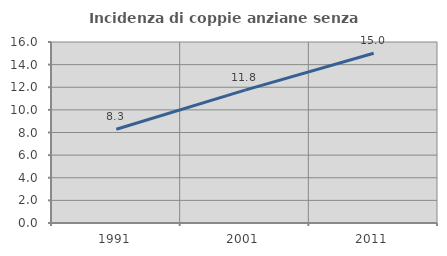
| Category | Incidenza di coppie anziane senza figli  |
|---|---|
| 1991.0 | 8.292 |
| 2001.0 | 11.75 |
| 2011.0 | 15.009 |